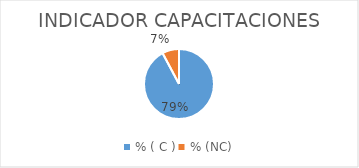
| Category | Series 0 |
|---|---|
| % ( C ) | 0.789 |
| % (NC) | 0.067 |